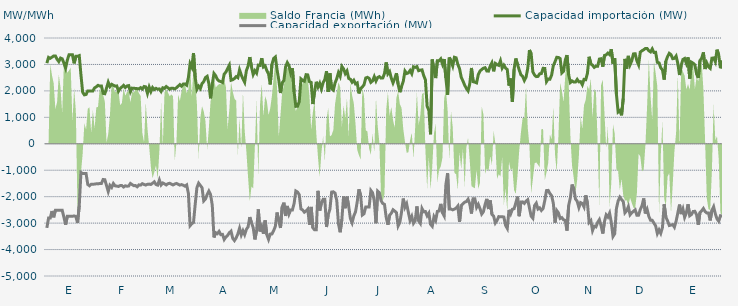
| Category | Capacidad importación (MW) | Capacidad exportación (MW) |
|---|---|---|
| 0 | 3050 | -3181.25 |
| 1900-01-01 | 3266.667 | -2808.333 |
| 1900-01-02 | 3233.333 | -2808.333 |
| 1900-01-03 | 3275 | -2543.75 |
| 1900-01-04 | 3320.833 | -2779.167 |
| 1900-01-05 | 3320.833 | -2516.667 |
| 1900-01-06 | 3195.833 | -2516.667 |
| 1900-01-07 | 3108.333 | -2516.667 |
| 1900-01-08 | 3241.667 | -2516.667 |
| 1900-01-09 | 3212.5 | -2516.667 |
| 1900-01-10 | 3054.167 | -2775 |
| 1900-01-11 | 2862.5 | -3058.333 |
| 1900-01-12 | 3162.5 | -2741.667 |
| 1900-01-13 | 3366.667 | -2741.667 |
| 1900-01-14 | 3366.667 | -2741.667 |
| 1900-01-15 | 3366.667 | -2741.667 |
| 1900-01-16 | 3041.667 | -2729.167 |
| 1900-01-17 | 3306.25 | -2750 |
| 1900-01-18 | 3306.25 | -2991.667 |
| 1900-01-19 | 3333.333 | -2337.5 |
| 1900-01-20 | 2602.083 | -1083.333 |
| 1900-01-21 | 1950 | -1125 |
| 1900-01-22 | 1850 | -1125 |
| 1900-01-23 | 1866.667 | -1125 |
| 1900-01-24 | 2000 | -1537.5 |
| 1900-01-25 | 2000 | -1587.5 |
| 1900-01-26 | 2000 | -1529.167 |
| 1900-01-27 | 2000 | -1529.167 |
| 1900-01-28 | 2114.583 | -1525 |
| 1900-01-29 | 2154.167 | -1512.5 |
| 1900-01-30 | 2210.417 | -1516.667 |
| 1900-01-31 | 2183.333 | -1500 |
| 1900-02-01 | 2185.417 | -1500 |
| 1900-02-02 | 1906.25 | -1350 |
| 1900-02-03 | 1893.75 | -1358.333 |
| 1900-02-04 | 2104.167 | -1579.167 |
| 1900-02-05 | 2328.375 | -1804.167 |
| 1900-02-06 | 2166.667 | -1572.917 |
| 1900-02-07 | 2250 | -1650 |
| 1900-02-08 | 2212.5 | -1502.083 |
| 1900-02-09 | 2179.167 | -1589.583 |
| 1900-02-10 | 2187.5 | -1600 |
| 1900-02-11 | 1987.5 | -1612.5 |
| 1900-02-12 | 2091.667 | -1581.25 |
| 1900-02-13 | 2147.917 | -1581.25 |
| 1900-02-14 | 2208.333 | -1635.417 |
| 1900-02-15 | 2127.083 | -1589.583 |
| 1900-02-16 | 2185.417 | -1604.167 |
| 1900-02-17 | 2200 | -1597.917 |
| 1900-02-18 | 1966.667 | -1500 |
| 1900-02-19 | 2104.167 | -1545.833 |
| 1900-02-20 | 2102.083 | -1583.333 |
| 1900-02-21 | 2089.583 | -1581.25 |
| 1900-02-22 | 2085.417 | -1627.083 |
| 1900-02-23 | 2075 | -1554.167 |
| 1900-02-24 | 2122.917 | -1562.5 |
| 1900-02-25 | 2072.917 | -1508.333 |
| 1900-02-26 | 2166.667 | -1539.583 |
| 1900-02-27 | 2152.083 | -1560.417 |
| 1900-02-28 | 1908.333 | -1531.25 |
| 1900-02-28 | 2145.833 | -1525 |
| 1900-03-01 | 1972.917 | -1539.583 |
| 1900-03-02 | 2125 | -1491.667 |
| 1900-03-03 | 2050 | -1437.5 |
| 1900-03-04 | 2095.833 | -1539.583 |
| 1900-03-05 | 2062.5 | -1562.5 |
| 1900-03-06 | 2075 | -1368.75 |
| 1900-03-07 | 1979.167 | -1556.25 |
| 1900-03-08 | 2116.667 | -1481.25 |
| 1900-03-09 | 2093.75 | -1516.667 |
| 1900-03-10 | 2164.583 | -1556.25 |
| 1900-03-11 | 2116.667 | -1508.333 |
| 1900-03-12 | 2060.417 | -1493.75 |
| 1900-03-13 | 2102.083 | -1525 |
| 1900-03-14 | 2100 | -1556.25 |
| 1900-03-15 | 2075 | -1520.833 |
| 1900-03-16 | 2118.75 | -1500 |
| 1900-03-17 | 2177.083 | -1529.167 |
| 1900-03-18 | 2239.583 | -1562.5 |
| 1900-03-19 | 2177.083 | -1543.75 |
| 1900-03-20 | 2262.5 | -1568.75 |
| 1900-03-21 | 2260.417 | -1602.083 |
| 1900-03-22 | 2214.583 | -1556.25 |
| 1900-03-23 | 2506.25 | -1879.583 |
| 1900-03-24 | 3029.083 | -3096.667 |
| 1900-03-25 | 2897.083 | -3021.292 |
| 1900-03-26 | 3432.292 | -2977.083 |
| 1900-03-27 | 2507.25 | -2284.333 |
| 1900-03-28 | 2060.87 | -1658.696 |
| 1900-03-29 | 2179.167 | -1489.583 |
| 1900-03-30 | 2087.5 | -1575 |
| 1900-03-31 | 2277.417 | -1660.417 |
| 1900-04-01 | 2351.25 | -2160.417 |
| 1900-04-02 | 2503.458 | -2091.667 |
| 1900-04-03 | 2550 | -1920.833 |
| 1900-04-04 | 2281.458 | -1791.667 |
| 1900-04-05 | 1718.75 | -1920.833 |
| 1900-04-06 | 2254.5 | -2322.583 |
| 1900-04-07 | 2658.208 | -3541.417 |
| 1900-04-08 | 2574.708 | -3362.292 |
| 1900-04-09 | 2431.25 | -3398.958 |
| 1900-04-10 | 2374.5 | -3312.25 |
| 1900-04-11 | 2351.333 | -3435.417 |
| 1900-04-12 | 2317.583 | -3426.125 |
| 1900-04-13 | 2635.542 | -3620.708 |
| 1900-04-14 | 2711.542 | -3524.292 |
| 1900-04-15 | 2845.917 | -3464.708 |
| 1900-04-16 | 2969.417 | -3364.5 |
| 1900-04-17 | 2400.667 | -3304.667 |
| 1900-04-18 | 2423.292 | -3576.333 |
| 1900-04-19 | 2466.583 | -3661.208 |
| 1900-04-20 | 2539.583 | -3559.167 |
| 1900-04-21 | 2499 | -3412.958 |
| 1900-04-22 | 2794.042 | -3192.833 |
| 1900-04-23 | 2600.917 | -3446.833 |
| 1900-04-24 | 2454.333 | -3287.042 |
| 1900-04-25 | 2327 | -3437.333 |
| 1900-04-26 | 2764.875 | -3237.25 |
| 1900-04-27 | 2938.333 | -3142.542 |
| 1900-04-28 | 3277.667 | -2773.208 |
| 1900-04-29 | 2901.792 | -2987.042 |
| 1900-04-30 | 2620.125 | -3170.125 |
| 1900-05-01 | 2763 | -3616.833 |
| 1900-05-02 | 2671.542 | -3275.667 |
| 1900-05-03 | 2975.208 | -2481.333 |
| 1900-05-04 | 2963.292 | -3314.083 |
| 1900-05-05 | 3237.125 | -3127.25 |
| 1900-05-06 | 2903.125 | -3401.25 |
| 1900-05-07 | 2943.875 | -2899.917 |
| 1900-05-08 | 2767.417 | -3439.375 |
| 1900-05-09 | 2641.75 | -3616.75 |
| 1900-05-10 | 2244.417 | -3416.167 |
| 1900-05-11 | 3003.875 | -3408.875 |
| 1900-05-12 | 3226.875 | -3283.375 |
| 1900-05-13 | 3282.292 | -3121.542 |
| 1900-05-14 | 2800 | -2600 |
| 1900-05-15 | 2416.667 | -2918.75 |
| 1900-05-16 | 1920.333 | -3184.333 |
| 1900-05-17 | 2307.917 | -2385.917 |
| 1900-05-18 | 2390.792 | -2227.542 |
| 1900-05-19 | 2911.125 | -2730 |
| 1900-05-20 | 3070.25 | -2350.458 |
| 1900-05-21 | 2956.667 | -2656.375 |
| 1900-05-22 | 2670.833 | -2500 |
| 1900-05-23 | 2854.167 | -2500 |
| 1900-05-24 | 1964.208 | -2255.75 |
| 1900-05-25 | 1414.583 | -1785.417 |
| 1900-05-26 | 1420.833 | -1825 |
| 1900-05-27 | 1591.667 | -1922.917 |
| 1900-05-28 | 2454.167 | -2465 |
| 1900-05-29 | 2398.083 | -2503.583 |
| 1900-05-30 | 2366.667 | -2588.042 |
| 1900-05-31 | 2613.333 | -2542.833 |
| 1900-06-01 | 2604.917 | -2471 |
| 1900-06-02 | 2348.667 | -3059.875 |
| 1900-06-03 | 2320.833 | -2387.5 |
| 1900-06-04 | 1502.083 | -3177.542 |
| 1900-06-05 | 1981.25 | -3254.458 |
| 1900-06-06 | 2343.208 | -3252.458 |
| 1900-06-07 | 2147.917 | -1780 |
| 1900-06-08 | 2287.5 | -2525 |
| 1900-06-09 | 2076.167 | -2245.833 |
| 1900-06-10 | 2310.167 | -2100 |
| 1900-06-11 | 2432.875 | -2100 |
| 1900-06-12 | 2745.667 | -3148.25 |
| 1900-06-13 | 1962.5 | -2676.167 |
| 1900-06-14 | 2660.917 | -2469.583 |
| 1900-06-15 | 2079.167 | -1827.083 |
| 1900-06-16 | 2027.083 | -1816.667 |
| 1900-06-17 | 2300 | -1864.583 |
| 1900-06-18 | 2462.5 | -2143.75 |
| 1900-06-19 | 2691.458 | -3018.958 |
| 1900-06-20 | 2552.792 | -3345.333 |
| 1900-06-21 | 2923.125 | -2854.917 |
| 1900-06-22 | 2833.042 | -1993.167 |
| 1900-06-23 | 2653.792 | -2436 |
| 1900-06-24 | 2753.958 | -1999.792 |
| 1900-06-25 | 2473.333 | -2362.833 |
| 1900-06-26 | 2441.667 | -2824.792 |
| 1900-06-27 | 2328.458 | -2988.458 |
| 1900-06-28 | 2403.5 | -2728.542 |
| 1900-06-29 | 2265.917 | -2574.25 |
| 1900-06-30 | 2301.833 | -2201.042 |
| 1900-07-01 | 1903.333 | -1720.833 |
| 1900-07-02 | 2094.667 | -1947.917 |
| 1900-07-03 | 2147.917 | -2694.292 |
| 1900-07-04 | 2232.083 | -2646 |
| 1900-07-05 | 2487.5 | -2387.5 |
| 1900-07-06 | 2512.5 | -2387.5 |
| 1900-07-07 | 2472.917 | -2387.5 |
| 1900-07-08 | 2322 | -1764.625 |
| 1900-07-09 | 2377.5 | -1853.5 |
| 1900-07-10 | 2540.458 | -2160.917 |
| 1900-07-11 | 2372.875 | -3004.125 |
| 1900-07-12 | 2508.625 | -1791.125 |
| 1900-07-13 | 2539.208 | -1849.75 |
| 1900-07-14 | 2483.208 | -2155.417 |
| 1900-07-15 | 2490.375 | -2256.75 |
| 1900-07-16 | 2658.333 | -2291.667 |
| 1900-07-17 | 3076.5 | -2786.667 |
| 1900-07-18 | 2645.958 | -3061.667 |
| 1900-07-19 | 2731.458 | -2699.25 |
| 1900-07-20 | 2480.417 | -2627.458 |
| 1900-07-21 | 2300.833 | -2495 |
| 1900-07-22 | 2461.958 | -2546.167 |
| 1900-07-23 | 2667.458 | -2604.875 |
| 1900-07-24 | 2250.333 | -3105.542 |
| 1900-07-25 | 1952.083 | -2970.875 |
| 1900-07-26 | 2172 | -2579.417 |
| 1900-07-27 | 2356.083 | -2071.833 |
| 1900-07-28 | 2750.708 | -2400.667 |
| 1900-07-29 | 2658.875 | -2268.083 |
| 1900-07-30 | 2681 | -2596.625 |
| 1900-07-31 | 2770.75 | -2898.375 |
| 1900-08-01 | 2648.75 | -2746.625 |
| 1900-08-02 | 2910.167 | -3009.083 |
| 1900-08-03 | 2888.542 | -2911.458 |
| 1900-08-04 | 2919.917 | -2370.542 |
| 1900-08-05 | 2763.333 | -2914.917 |
| 1900-08-06 | 2782.917 | -3008.083 |
| 1900-08-07 | 2795.542 | -2448.708 |
| 1900-08-08 | 2576.25 | -2572.292 |
| 1900-08-09 | 2415.583 | -2563.292 |
| 1900-08-10 | 1418.917 | -2723.958 |
| 1900-08-11 | 1264.583 | -2622.458 |
| 1900-08-12 | 358.333 | -3044.542 |
| 1900-08-13 | 3186.917 | -3120.333 |
| 1900-08-14 | 2791.875 | -2763.458 |
| 1900-08-15 | 2484.583 | -2895.958 |
| 1900-08-16 | 3137.583 | -2556.25 |
| 1900-08-17 | 3137.5 | -2540.875 |
| 1900-08-18 | 3211 | -2273.125 |
| 1900-08-19 | 3012.542 | -2608.417 |
| 1900-08-20 | 3204.542 | -2728.708 |
| 1900-08-21 | 2487.333 | -1541.875 |
| 1900-08-22 | 1853.333 | -1112.917 |
| 1900-08-23 | 3263.917 | -2468.833 |
| 1900-08-24 | 3130.375 | -2468.375 |
| 1900-08-25 | 2944.542 | -2498.083 |
| 1900-08-26 | 3271.625 | -2470.667 |
| 1900-08-27 | 3250.667 | -2433.5 |
| 1900-08-28 | 3002.292 | -2354.917 |
| 1900-08-29 | 2842.625 | -2955.417 |
| 1900-08-30 | 2513.542 | -2337.375 |
| 1900-08-31 | 2375 | -2269.958 |
| 1900-09-01 | 2218.75 | -2210.458 |
| 1900-09-02 | 2093.75 | -2184.542 |
| 1900-09-03 | 2002.083 | -2097.042 |
| 1900-09-04 | 2264.583 | -2273.583 |
| 1900-09-05 | 2866.875 | -2637 |
| 1900-09-06 | 2346.958 | -2079.75 |
| 1900-09-07 | 2329.625 | -2082.083 |
| 1900-09-08 | 2302.458 | -2405.417 |
| 1900-09-09 | 2617.333 | -2289.667 |
| 1900-09-10 | 2750.042 | -2452.833 |
| 1900-09-11 | 2809.125 | -2657.958 |
| 1900-09-12 | 2857.375 | -2569.75 |
| 1900-09-13 | 2876.833 | -2291.708 |
| 1900-09-14 | 2750.708 | -2082.833 |
| 1900-09-15 | 2747.333 | -2466.667 |
| 1900-09-16 | 2937.458 | -2144.25 |
| 1900-09-17 | 3062.458 | -2672.417 |
| 1900-09-18 | 2740.417 | -2737.792 |
| 1900-09-19 | 3040.542 | -2994.125 |
| 1900-09-20 | 2995.708 | -2899.083 |
| 1900-09-21 | 2964.458 | -2754.583 |
| 1900-09-22 | 3138.792 | -2763.917 |
| 1900-09-23 | 2861.083 | -2758.667 |
| 1900-09-24 | 2973.75 | -2769.708 |
| 1900-09-25 | 2865 | -3086.792 |
| 1900-09-26 | 2805.417 | -3199.875 |
| 1900-09-27 | 2200 | -2500 |
| 1900-09-28 | 2468.25 | -2649 |
| 1900-09-29 | 1587.5 | -2475 |
| 1900-09-30 | 2818.542 | -2455.458 |
| 1900-10-01 | 3225.708 | -2239.583 |
| 1900-10-02 | 3000 | -2000 |
| 1900-10-03 | 2791.958 | -2738.25 |
| 1900-10-04 | 2607.167 | -2198.667 |
| 1900-10-05 | 2547.125 | -2197 |
| 1900-10-06 | 2393.292 | -2255.25 |
| 1900-10-07 | 2516 | -2169.167 |
| 1900-10-08 | 2853.667 | -2114.625 |
| 1900-10-09 | 3545.458 | -2428.042 |
| 1900-10-10 | 3402.833 | -2737.792 |
| 1900-10-11 | 2716.792 | -2816.833 |
| 1900-10-12 | 2599.417 | -2338.083 |
| 1900-10-13 | 2539.208 | -2246.333 |
| 1900-10-14 | 2547.375 | -2467.5 |
| 1900-10-15 | 2645.583 | -2424.333 |
| 1900-10-16 | 2654.167 | -2520.833 |
| 1900-10-17 | 2852.417 | -2448.375 |
| 1900-10-18 | 2850 | -2144.833 |
| 1900-10-19 | 2350 | -1768.75 |
| 1900-10-20 | 2450 | -1762.5 |
| 1900-10-21 | 2441.667 | -1881.25 |
| 1900-10-22 | 2597.917 | -1964.583 |
| 1900-10-23 | 2954.167 | -2250 |
| 1900-10-24 | 3102.32 | -2983.84 |
| 1900-10-25 | 3270.125 | -2524.167 |
| 1900-10-26 | 3263.958 | -2613.375 |
| 1900-10-27 | 3221.25 | -2826.5 |
| 1900-10-28 | 2678.333 | -2792.5 |
| 1900-10-29 | 2739.75 | -2875.042 |
| 1900-10-30 | 3161.75 | -2895.917 |
| 1900-10-31 | 3353.167 | -3283.208 |
| 1900-11-01 | 2604.75 | -2336.125 |
| 1900-11-02 | 2316.667 | -2037.25 |
| 1900-11-03 | 2377.083 | -1541.667 |
| 1900-11-04 | 2335.417 | -1708.333 |
| 1900-11-05 | 2333.083 | -2087.5 |
| 1900-11-06 | 2432.958 | -2175.833 |
| 1900-11-07 | 2341.417 | -2411.458 |
| 1900-11-08 | 2350 | -2224.167 |
| 1900-11-09 | 2233.333 | -2255.875 |
| 1900-11-10 | 2436.333 | -2388.333 |
| 1900-11-11 | 2422.917 | -1949.75 |
| 1900-11-12 | 2664.167 | -2243.25 |
| 1900-11-13 | 3289.125 | -2974.875 |
| 1900-11-14 | 3022.042 | -2905.375 |
| 1900-11-15 | 2967.917 | -3281.292 |
| 1900-11-16 | 2888.083 | -3117.75 |
| 1900-11-17 | 2932.458 | -3142.792 |
| 1900-11-18 | 2934.917 | -2973.208 |
| 1900-11-19 | 3202.583 | -2869.458 |
| 1900-11-20 | 3215.75 | -3094.417 |
| 1900-11-21 | 2915.5 | -3393.375 |
| 1900-11-22 | 3338.625 | -2938.583 |
| 1900-11-23 | 3362.542 | -2687.333 |
| 1900-11-24 | 3428.958 | -2770.5 |
| 1900-11-25 | 3372 | -2622.5 |
| 1900-11-26 | 3574.375 | -2972.542 |
| 1900-11-27 | 3028.917 | -3504.875 |
| 1900-11-28 | 3239.167 | -3400.917 |
| 1900-11-29 | 1878.75 | -2447.25 |
| 1900-11-30 | 1204.167 | -2164.583 |
| 1900-12-01 | 1258.333 | -2018.75 |
| 1900-12-02 | 1077.083 | -2108.333 |
| 1900-12-03 | 1711.917 | -2183.333 |
| 1900-12-04 | 3210.167 | -2609.5 |
| 1900-12-05 | 2835.417 | -2533.333 |
| 1900-12-06 | 3323.833 | -2378.417 |
| 1900-12-07 | 2986.708 | -2684.958 |
| 1900-12-08 | 3136.75 | -2609.25 |
| 1900-12-09 | 3398.958 | -2552.333 |
| 1900-12-10 | 3404.708 | -2496.458 |
| 1900-12-11 | 3136.792 | -2703.625 |
| 1900-12-12 | 2984.417 | -2700 |
| 1900-12-13 | 3466.5 | -2483.792 |
| 1900-12-14 | 3518.5 | -2345.833 |
| 1900-12-15 | 3555.167 | -2067 |
| 1900-12-16 | 3605.208 | -2635.583 |
| 1900-12-17 | 3603.083 | -2480.625 |
| 1900-12-18 | 3517.167 | -2743.458 |
| 1900-12-19 | 3473.958 | -2890.375 |
| 1900-12-20 | 3587.875 | -2893.625 |
| 1900-12-21 | 3454.583 | -3000.667 |
| 1900-12-22 | 3456.875 | -3104.042 |
| 1900-12-23 | 3080.708 | -3395.083 |
| 1900-12-24 | 3059.792 | -3254.417 |
| 1900-12-25 | 2872.417 | -3385.667 |
| 1900-12-26 | 2791.792 | -3162.083 |
| 1900-12-27 | 2427.708 | -2287.5 |
| 1900-12-28 | 3123.125 | -2773 |
| 1900-12-29 | 3298.917 | -2914.542 |
| 1900-12-30 | 3420.292 | -3090.167 |
| 1900-12-31 | 3370.083 | -3074.542 |
| 1901-01-01 | 3217.542 | -3055.958 |
| 1901-01-02 | 3229.292 | -3154.333 |
| 1901-01-03 | 3317 | -2928.75 |
| 1901-01-04 | 3040.5 | -2617.875 |
| 1901-01-05 | 2600 | -2300 |
| 1901-01-06 | 2973.125 | -2658.375 |
| 1901-01-07 | 3188.5 | -2468 |
| 1901-01-08 | 3225.417 | -2780.667 |
| 1901-01-09 | 3042.292 | -2615.25 |
| 1901-01-10 | 3269.292 | -2289.5 |
| 1901-01-11 | 2466.917 | -2722.042 |
| 1901-01-12 | 3087.042 | -2676.583 |
| 1901-01-13 | 3046.125 | -2559.917 |
| 1901-01-14 | 2981.833 | -2552.167 |
| 1901-01-15 | 2640.875 | -2681.583 |
| 1901-01-16 | 2488.417 | -3061.75 |
| 1901-01-17 | 3148 | -2596.625 |
| 1901-01-18 | 3235.333 | -2534.25 |
| 1901-01-19 | 3454.833 | -2446.292 |
| 1901-01-20 | 2826.208 | -2562.5 |
| 1901-01-21 | 3055.625 | -2616 |
| 1901-01-22 | 2910.667 | -2614.333 |
| 1901-01-23 | 2851.625 | -2898.833 |
| 1901-01-24 | 3236.792 | -2519.125 |
| 1901-01-25 | 3247.417 | -2381.958 |
| 1901-01-26 | 3102.208 | -2645.667 |
| 1901-01-27 | 3559.042 | -2840.083 |
| 1901-01-28 | 3354.708 | -2929.5 |
| 1901-01-29 | 2857.208 | -2721.292 |
| 1901-01-30 | 3142.708 | -2736.667 |